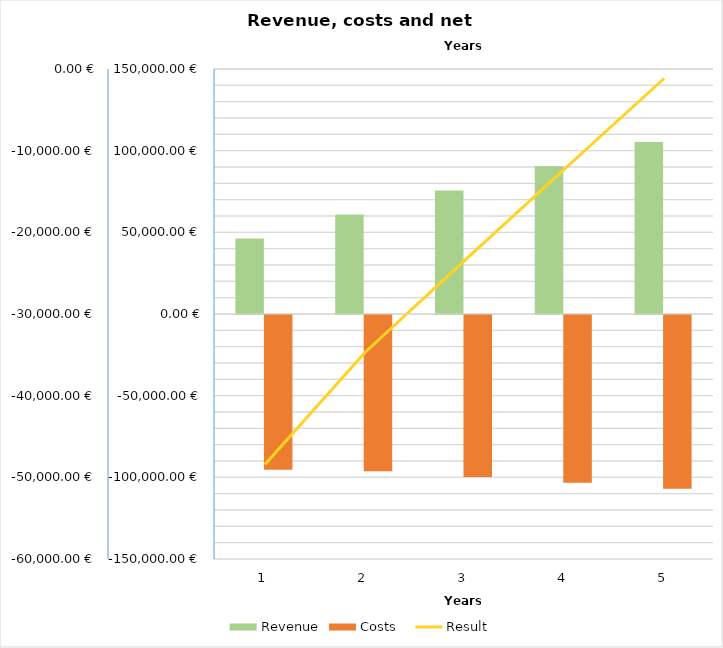
| Category | Revenue | Costs   |
|---|---|---|
| 1 | 46265 | -94681.16 |
| 2 | 60925 | -95670.991 |
| 3 | 75645 | -99118.511 |
| 4 | 90425 | -102702.345 |
| 5 | 105265 | -106428.001 |